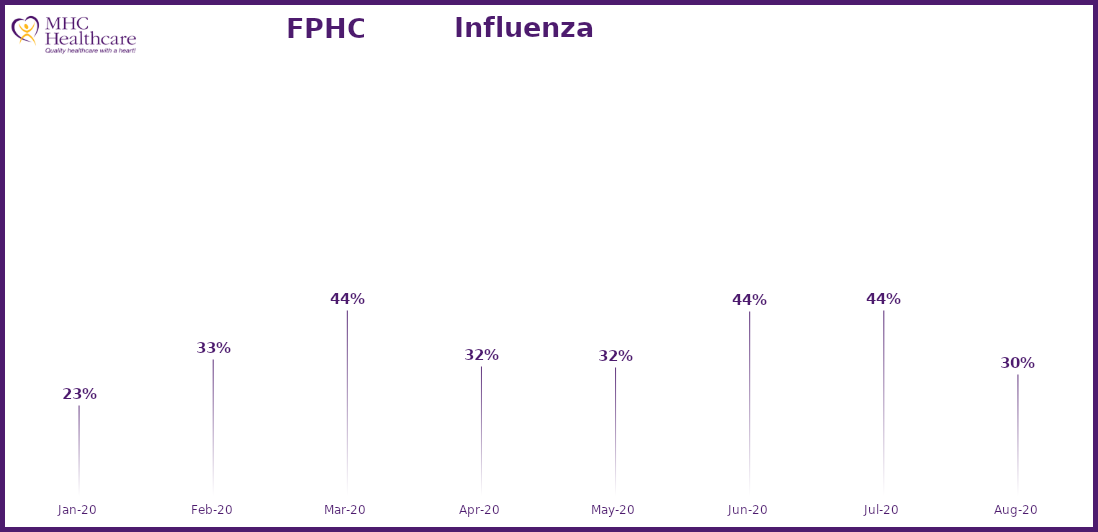
| Category | Online Access to Health Information |
|---|---|
| 2020-01-01 | 0.231 |
| 2020-02-01 | 0.333 |
| 2020-03-01 | 0.444 |
| 2020-04-01 | 0.318 |
| 2020-05-01 | 0.316 |
| 2020-06-01 | 0.441 |
| 2020-07-01 | 0.444 |
| 2020-08-01 | 0.3 |